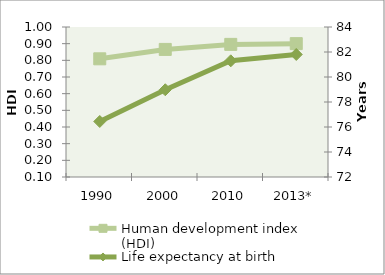
| Category | Human development index (HDI) |
|---|---|
| 1990 | 0.809 |
| 2000 | 0.865 |
| 2010 | 0.896 |
| 2013* | 0.9 |